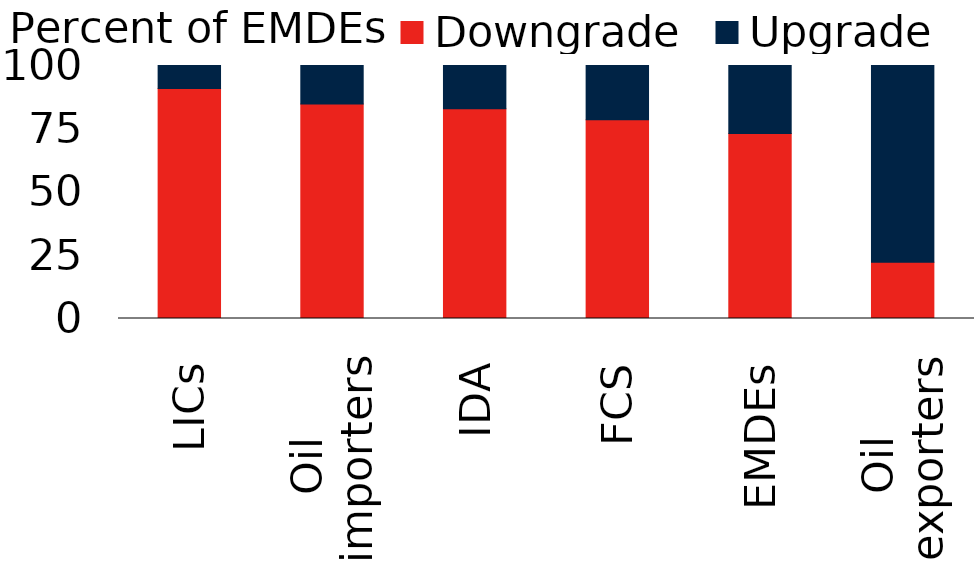
| Category | Downgrade | Upgrade |
|---|---|---|
| LICs | 90.9 | 9.1 |
| Oil 
importers | 84.8 | 15.3 |
| IDA | 82.9 | 17.1 |
| FCS | 78.6 | 21.4 |
| EMDEs | 73.1 | 26.9 |
| Oil 
exporters | 22.2 | 77.8 |